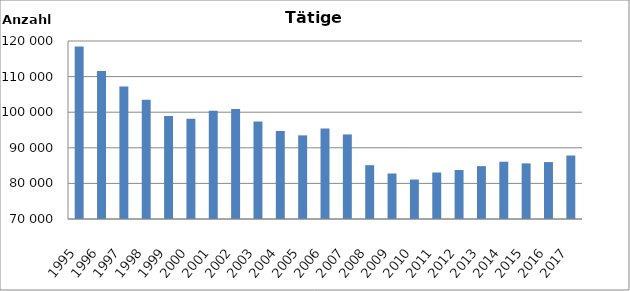
| Category | 1995 1996 1997 1998 1999 2000 2001 2002 2003 2004 2005 2006 2007 2008 2009 2010 2011 2012 2013 2014 2015 2016 2017 |
|---|---|
| 1995 | 118464 |
| 1996 | 111544 |
| 1997 | 107253 |
| 1998 | 103463 |
| 1999 | 98926 |
| 2000 | 98154 |
| 2001 | 100422 |
| 2002 | 100868 |
| 2003 | 97367 |
| 2004 | 94725 |
| 2005 | 93496 |
| 2006 | 95427 |
| 2007 | 93755 |
| 2008 | 85118 |
| 2009 | 82782 |
| 2010 | 81089 |
| 2011 | 83058 |
| 2012 | 83766 |
| 2013 | 84853 |
| 2014 | 86087 |
| 2015 | 85622 |
| 2016 | 85986 |
| 2017 | 87831 |